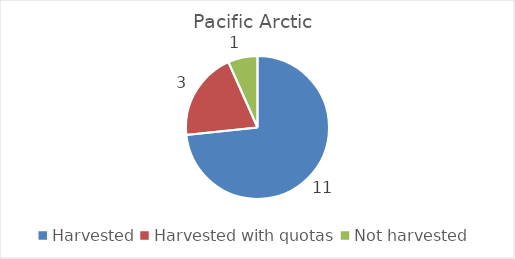
| Category | Pacific Arctic |
|---|---|
| Harvested | 11 |
| Harvested with quotas | 3 |
| Not harvested | 1 |